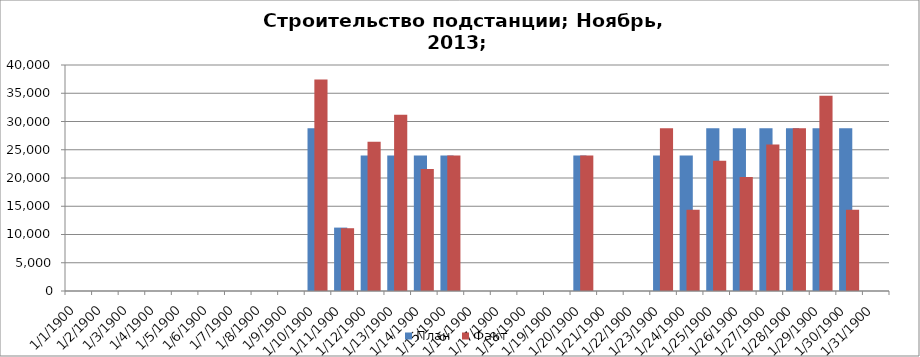
| Category | План | Факт |
|---|---|---|
| 1.0 | 0 | 0 |
| 2.0 | 0 | 0 |
| 3.0 | 0 | 0 |
| 4.0 | 0 | 0 |
| 5.0 | 0 | 0 |
| 6.0 | 0 | 0 |
| 7.0 | 0 | 0 |
| 8.0 | 0 | 0 |
| 9.0 | 0 | 0 |
| 10.0 | 28800 | 37440 |
| 11.0 | 11222 | 11111 |
| 12.0 | 24000 | 26400 |
| 13.0 | 24000 | 31200 |
| 14.0 | 24000 | 21600 |
| 15.0 | 24000 | 24000 |
| 16.0 | 0 | 0 |
| 17.0 | 0 | 0 |
| 18.0 | 0 | 0 |
| 19.0 | 0 | 0 |
| 20.0 | 24000 | 24000 |
| 21.0 | 0 | 0 |
| 22.0 | 0 | 0 |
| 23.0 | 24000 | 28800 |
| 24.0 | 24000 | 14400 |
| 25.0 | 28800 | 23040 |
| 26.0 | 28800 | 20160 |
| 27.0 | 28800 | 25920 |
| 28.0 | 28800 | 28800 |
| 29.0 | 28800 | 34560 |
| 30.0 | 28800 | 14400 |
| 31.0 | 0 | 0 |